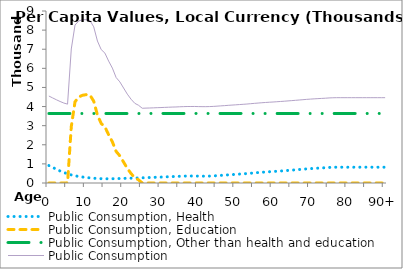
| Category | Public Consumption, Health | Public Consumption, Education | Public Consumption, Other than health and education | Public Consumption |
|---|---|---|---|---|
| 0 | 912.668 | 0 | 3637.554 | 4550.223 |
|  | 815.838 | 0 | 3637.554 | 4453.392 |
| 2 | 719.007 | 0 | 3637.554 | 4356.561 |
| 3 | 627.88 | 0 | 3637.554 | 4265.434 |
| 4 | 546.409 | 0 | 3637.554 | 4183.964 |
| 5 | 479.256 | 8.934 | 3637.554 | 4125.744 |
| 6 | 422.844 | 2952.746 | 3637.554 | 7013.144 |
| 7 | 377.742 | 4251.144 | 3637.554 | 8266.441 |
| 8 | 342.109 | 4496.994 | 3637.554 | 8476.658 |
| 9 | 313.39 | 4591.236 | 3637.554 | 8542.18 |
| 10 | 287.279 | 4622.55 | 3637.554 | 8547.383 |
| 11 | 266.397 | 4598.313 | 3637.554 | 8502.264 |
| 12 | 249.565 | 4284.123 | 3637.554 | 8171.242 |
| 13 | 235.5 | 3555.324 | 3637.554 | 7428.378 |
| 14 | 226.386 | 3118.779 | 3637.554 | 6982.72 |
| 15 | 221.62 | 2936.758 | 3637.554 | 6795.932 |
| 16 | 220.047 | 2519.875 | 3637.554 | 6377.476 |
| 17 | 222.648 | 2152.261 | 3637.554 | 6012.463 |
| 18 | 228.608 | 1653.674 | 3637.554 | 5519.836 |
| 19 | 233.873 | 1418.665 | 3637.554 | 5290.092 |
| 20 | 240.727 | 1092.336 | 3637.554 | 4970.617 |
| 21 | 246.402 | 765.515 | 3637.554 | 4649.472 |
| 22 | 252.479 | 493.371 | 3637.554 | 4383.404 |
| 23 | 257.906 | 273.985 | 3637.554 | 4169.445 |
| 24 | 264.666 | 164.012 | 3637.554 | 4066.232 |
| 25 | 271.773 | 1.632 | 3637.554 | 3910.959 |
| 26 | 280.048 | 1.854 | 3637.554 | 3919.456 |
| 27 | 287.021 | 0 | 3637.554 | 3924.575 |
| 28 | 294.637 | 0 | 3637.554 | 3932.192 |
| 29 | 303.615 | 0 | 3637.554 | 3941.169 |
| 30 | 310.532 | 0 | 3637.554 | 3948.086 |
| 31 | 318.877 | 0 | 3637.554 | 3956.432 |
| 32 | 327.039 | 0 | 3637.554 | 3964.593 |
| 33 | 335.284 | 0 | 3637.554 | 3972.838 |
| 34 | 340.514 | 0 | 3637.554 | 3978.069 |
| 35 | 351.07 | 0 | 3637.554 | 3988.624 |
| 36 | 358.538 | 0 | 3637.554 | 3996.092 |
| 37 | 364.935 | 0 | 3637.554 | 4002.489 |
| 38 | 365.306 | 0 | 3637.554 | 4002.86 |
| 39 | 366.414 | 0 | 3637.554 | 4003.969 |
| 40 | 361.084 | 0 | 3637.554 | 3998.638 |
| 41 | 357.286 | 0 | 3637.554 | 3994.84 |
| 42 | 356.484 | 0 | 3637.554 | 3994.039 |
| 43 | 361.627 | 0 | 3637.554 | 3999.182 |
| 44 | 369.92 | 0 | 3637.554 | 4007.474 |
| 45 | 383.495 | 0 | 3637.554 | 4021.05 |
| 46 | 397.621 | 0 | 3637.554 | 4035.175 |
| 47 | 410.633 | 0 | 3637.554 | 4048.188 |
| 48 | 426.358 | 0 | 3637.554 | 4063.912 |
| 49 | 439.717 | 0 | 3637.554 | 4077.271 |
| 50 | 452.543 | 0 | 3637.554 | 4090.097 |
| 51 | 466.073 | 0 | 3637.554 | 4103.628 |
| 52 | 480.274 | 0 | 3637.554 | 4117.828 |
| 53 | 494.482 | 0 | 3637.554 | 4132.036 |
| 54 | 511.808 | 0 | 3637.554 | 4149.362 |
| 55 | 528.969 | 0 | 3637.554 | 4166.523 |
| 56 | 545.696 | 0 | 3637.554 | 4183.25 |
| 57 | 561.864 | 0 | 3637.554 | 4199.419 |
| 58 | 576.164 | 0 | 3637.554 | 4213.719 |
| 59 | 588.834 | 0 | 3637.554 | 4226.388 |
| 60 | 600.772 | 0 | 3637.554 | 4238.326 |
| 61 | 613.989 | 0 | 3637.554 | 4251.543 |
| 62 | 627.804 | 0 | 3637.554 | 4265.359 |
| 63 | 642.444 | 0 | 3637.554 | 4279.999 |
| 64 | 657.322 | 0 | 3637.554 | 4294.877 |
| 65 | 672.786 | 0 | 3637.554 | 4310.34 |
| 66 | 688.551 | 0 | 3637.554 | 4326.106 |
| 67 | 704.864 | 0 | 3637.554 | 4342.418 |
| 68 | 721.265 | 0 | 3637.554 | 4358.819 |
| 69 | 738.257 | 0 | 3637.554 | 4375.812 |
| 70 | 752.361 | 0 | 3637.554 | 4389.915 |
| 71 | 765.517 | 0 | 3637.554 | 4403.071 |
| 72 | 777.265 | 0 | 3637.554 | 4414.819 |
| 73 | 788.211 | 0 | 3637.554 | 4425.766 |
| 74 | 799.066 | 0 | 3637.554 | 4436.62 |
| 75 | 813.568 | 0 | 3637.554 | 4451.122 |
| 76 | 822.255 | 0 | 3637.554 | 4459.809 |
| 77 | 826.639 | 0 | 3637.554 | 4464.193 |
| 78 | 826.639 | 0 | 3637.554 | 4464.193 |
| 79 | 826.639 | 0 | 3637.554 | 4464.193 |
| 80 | 826.639 | 0 | 3637.554 | 4464.193 |
| 81 | 826.639 | 0 | 3637.554 | 4464.193 |
| 82 | 826.639 | 0 | 3637.554 | 4464.193 |
| 83 | 826.639 | 0 | 3637.554 | 4464.193 |
| 84 | 826.639 | 0 | 3637.554 | 4464.193 |
| 85 | 826.639 | 0 | 3637.554 | 4464.193 |
| 86 | 826.639 | 0 | 3637.554 | 4464.193 |
| 87 | 826.639 | 0 | 3637.554 | 4464.193 |
| 88 | 826.639 | 0 | 3637.554 | 4464.193 |
| 89 | 826.639 | 0 | 3637.554 | 4464.193 |
| 90+ | 826.639 | 0 | 3637.554 | 4464.193 |